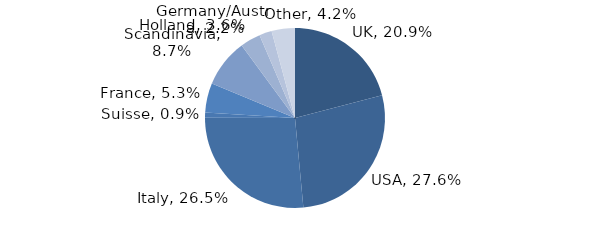
| Category | Investment Style |
|---|---|
| UK | 0.209 |
| USA | 0.276 |
| Italy | 0.265 |
| Suisse | 0.009 |
| France | 0.053 |
| Scandinavia | 0.087 |
| Holland | 0.036 |
| Germany/Austria | 0.022 |
| Other | 0.042 |